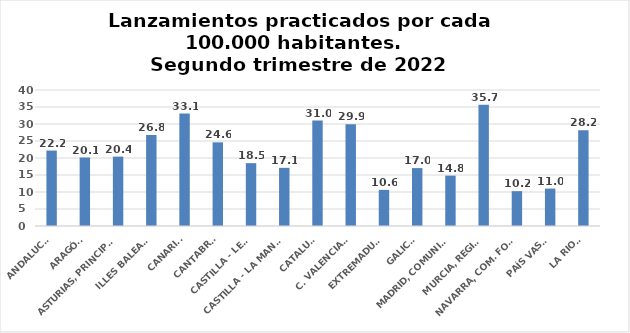
| Category | Series 0 |
|---|---|
| ANDALUCÍA | 22.189 |
| ARAGÓN | 20.146 |
| ASTURIAS, PRINCIPADO | 20.408 |
| ILLES BALEARS | 26.78 |
| CANARIAS | 33.082 |
| CANTABRIA | 24.606 |
| CASTILLA - LEÓN | 18.481 |
| CASTILLA - LA MANCHA | 17.104 |
| CATALUÑA | 31.015 |
| C. VALENCIANA | 29.936 |
| EXTREMADURA | 10.624 |
| GALICIA | 17.031 |
| MADRID, COMUNIDAD | 14.812 |
| MURCIA, REGIÓN | 35.653 |
| NAVARRA, COM. FORAL | 10.247 |
| PAÍS VASCO | 11.009 |
| LA RIOJA | 28.17 |